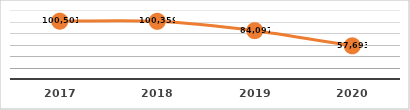
| Category | PERSONAS CAPACITADAS
TERCER TRIMESTRE, EJERCICIO 2020 |
|---|---|
| 2017.0 | 100501 |
| 2018.0 | 100359 |
| 2019.0 | 84097 |
| 2020.0 | 57693 |